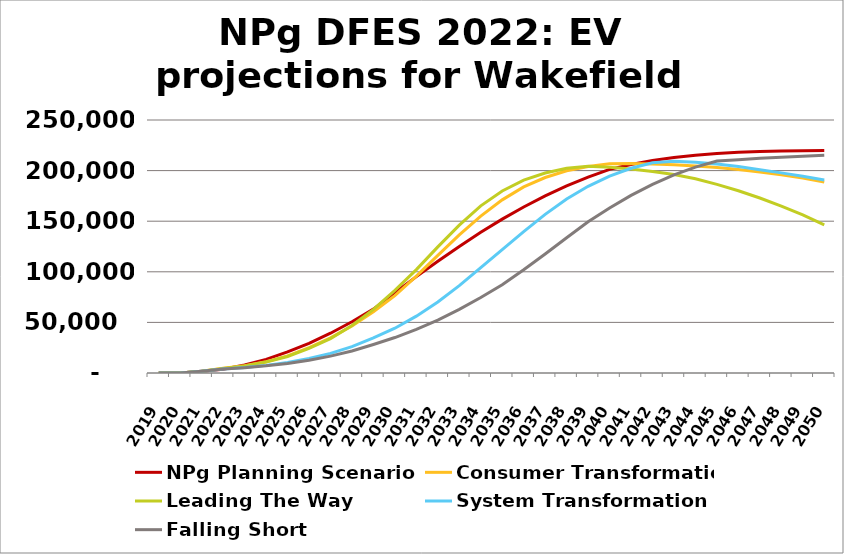
| Category | NPg Planning Scenario | Consumer Transformation | Leading The Way | System Transformation | Falling Short |
|---|---|---|---|---|---|
| 2019.0 | 0 | 0 | 0 | 0 | 0 |
| 2020.0 | 0 | 0 | 0 | 0 | 0 |
| 2021.0 | 1791 | 1791 | 1791 | 1791 | 1791 |
| 2022.0 | 3793 | 4616 | 4473 | 3915 | 3845 |
| 2023.0 | 7911 | 7229 | 7048 | 5451 | 5219 |
| 2024.0 | 13501 | 11192 | 10804 | 7538 | 7052 |
| 2025.0 | 20852 | 16927 | 16339 | 10384 | 9471 |
| 2026.0 | 29376 | 25139 | 24408 | 14268 | 12649 |
| 2027.0 | 39301 | 34679 | 34028 | 19367 | 16665 |
| 2028.0 | 50643 | 46476 | 46974 | 26043 | 21764 |
| 2029.0 | 63134 | 60505 | 62868 | 34648 | 28155 |
| 2030.0 | 79457 | 76504 | 81606 | 44249 | 35030 |
| 2031.0 | 95196 | 95773 | 102160 | 56148 | 43059 |
| 2032.0 | 110447 | 116212 | 124612 | 70185 | 52346 |
| 2033.0 | 125100 | 136519 | 146118 | 86306 | 62888 |
| 2034.0 | 138986 | 155071 | 165209 | 104053 | 74599 |
| 2035.0 | 152072 | 171079 | 179887 | 121859 | 87244 |
| 2036.0 | 164073 | 183840 | 190626 | 139781 | 102084 |
| 2037.0 | 174983 | 193159 | 197664 | 156719 | 117670 |
| 2038.0 | 184812 | 199822 | 202288 | 171893 | 133632 |
| 2039.0 | 193569 | 204030 | 204364 | 184512 | 149366 |
| 2040.0 | 201258 | 206721 | 203283 | 194565 | 163051 |
| 2041.0 | 206093 | 207053 | 201621 | 202318 | 175477 |
| 2042.0 | 209976 | 206531 | 199182 | 207740 | 186362 |
| 2043.0 | 212979 | 205692 | 196106 | 209291 | 195744 |
| 2044.0 | 215264 | 204526 | 191864 | 208185 | 203417 |
| 2045.0 | 216897 | 203018 | 186384 | 206516 | 209407 |
| 2046.0 | 218032 | 201063 | 180113 | 204081 | 210833 |
| 2047.0 | 218822 | 198637 | 172944 | 200808 | 212092 |
| 2048.0 | 219329 | 195955 | 164921 | 197748 | 213219 |
| 2049.0 | 219657 | 192629 | 156211 | 194469 | 214249 |
| 2050.0 | 219857 | 188744 | 146338 | 190780 | 215208 |